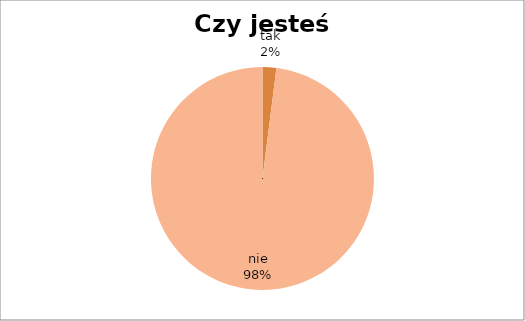
| Category | Czy jesteś wegetarianinem? |
|---|---|
| tak | 2 |
| nie | 98 |